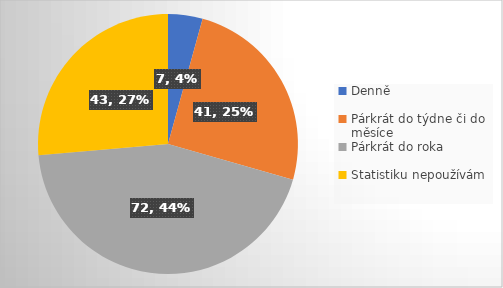
| Category | Series 0 |
|---|---|
| Denně | 7 |
| Párkrát do týdne či do měsíce | 41 |
| Párkrát do roka | 72 |
| Statistiku nepoužívám | 43 |